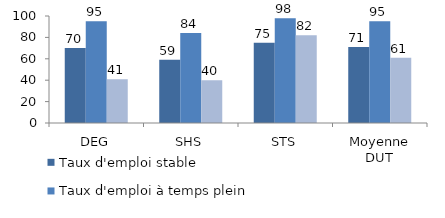
| Category | Taux d'emploi stable | Taux d'emploi à temps plein | Taux d'emploi de catégorie cadre ou professions intermédiaires |
|---|---|---|---|
| DEG | 70 | 95 | 41 |
| SHS | 59 | 84 | 40 |
| STS | 75 | 98 | 82 |
| Moyenne DUT | 71 | 95 | 61 |